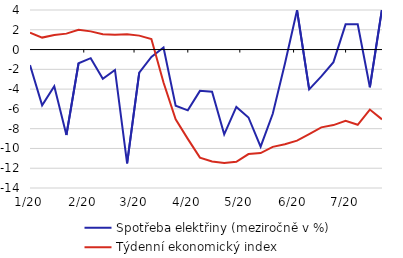
| Category | Spotřeba elektřiny (meziročně v %) | Týdenní ekonomický index |
|---|---|---|
| 2020-01-06 | -1.577 | 1.7 |
| 2020-01-13 | -5.647 | 1.21 |
| 2020-01-20 | -3.719 | 1.48 |
| 2020-01-27 | -8.641 | 1.61 |
| 2020-02-03 | -1.389 | 2 |
| 2020-02-10 | -0.87 | 1.84 |
| 2020-02-17 | -2.961 | 1.55 |
| 2020-02-24 | -2.065 | 1.5 |
| 2020-03-02 | -11.504 | 1.54 |
| 2020-03-09 | -2.327 | 1.41 |
| 2020-03-16 | -0.745 | 1.06 |
| 2020-03-23 | 0.211 | -3.33 |
| 2020-03-30 | -5.681 | -7.06 |
| 2020-04-06 | -6.145 | -9.03 |
| 2020-04-13 | -4.176 | -10.93 |
| 2020-04-20 | -4.258 | -11.32 |
| 2020-04-27 | -8.574 | -11.48 |
| 2020-05-04 | -5.804 | -11.35 |
| 2020-05-11 | -6.869 | -10.57 |
| 2020-05-18 | -9.822 | -10.47 |
| 2020-05-25 | -6.497 | -9.84 |
| 2020-06-01 | -1.432 | -9.58 |
| 2020-06-08 | 3.975 | -9.21 |
| 2020-06-15 | -4.029 | -8.55 |
| 2020-06-22 | -2.715 | -7.87 |
| 2020-06-29 | -1.276 | -7.64 |
| 2020-07-06 | 2.548 | -7.21 |
| 2020-07-13 | 2.548 | -7.61 |
| 2020-07-20 | -3.81 | -6.07 |
| 2020-07-27 | 4.091 | -7.06 |